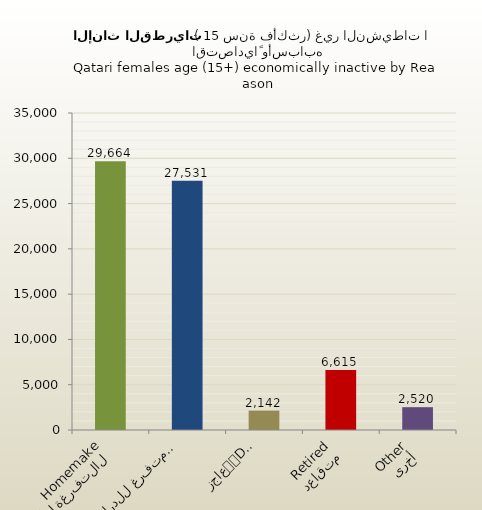
| Category | الاناث القطريات |
|---|---|
| التفرغة لأعمال المنزل
Homemaker | 29664 |
| متفرغ للدراسة
Student | 27531 |
| عاجز
Disabled | 2142 |
| متقاعد
Retired | 6615 |
| أخرى
Other | 2520 |